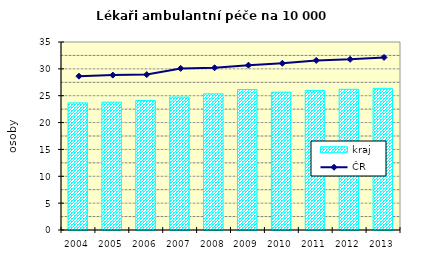
| Category | kraj |
|---|---|
| 2004.0 | 23.665 |
| 2005.0 | 23.799 |
| 2006.0 | 24.115 |
| 2007.0 | 24.746 |
| 2008.0 | 25.348 |
| 2009.0 | 26.151 |
| 2010.0 | 25.658 |
| 2011.0 | 25.956 |
| 2012.0 | 26.199 |
| 2013.0 | 26.375 |